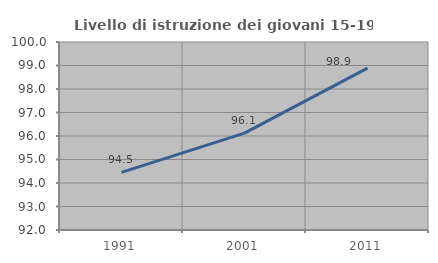
| Category | Livello di istruzione dei giovani 15-19 anni |
|---|---|
| 1991.0 | 94.452 |
| 2001.0 | 96.124 |
| 2011.0 | 98.891 |